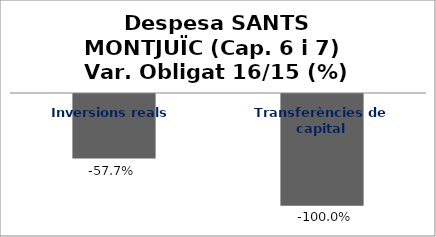
| Category | Series 0 |
|---|---|
| Inversions reals | -0.577 |
| Transferències de capital | -1 |